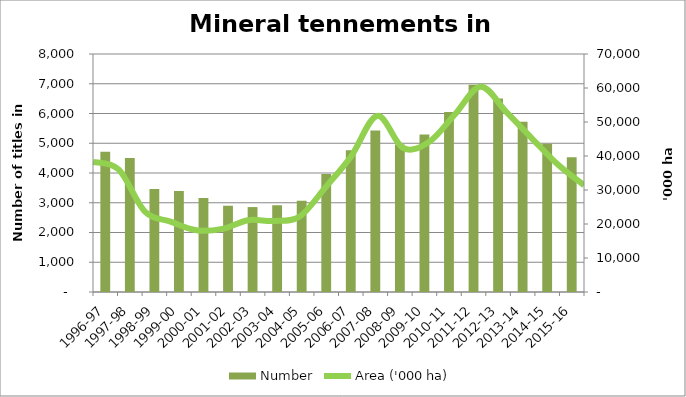
| Category | Number |
|---|---|
| 1996-97 | 4718 |
| 1997-98 | 4505 |
| 1998-99 | 3463 |
| 1999-00 | 3394 |
| 2000-01 | 3162 |
| 2001-02 | 2899 |
| 2002-03 | 2855 |
| 2003-04 | 2917 |
| 2004-05 | 3066 |
| 2005-06 | 3966 |
| 2006-07 | 4766 |
| 2007-08 | 5427 |
| 2008-09 | 4959 |
| 2009-10 | 5297 |
| 2010-11 | 6050 |
| 2011-12 | 6969 |
| 2012-13 | 6503 |
| 2013-14 | 5723 |
| 2014-15 | 4983 |
| 2015-16 | 4529 |